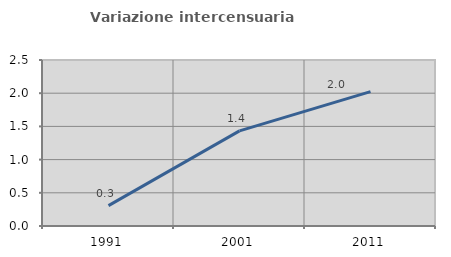
| Category | Variazione intercensuaria annua |
|---|---|
| 1991.0 | 0.308 |
| 2001.0 | 1.433 |
| 2011.0 | 2.023 |